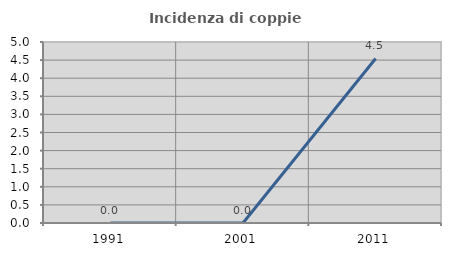
| Category | Incidenza di coppie miste |
|---|---|
| 1991.0 | 0 |
| 2001.0 | 0 |
| 2011.0 | 4.545 |